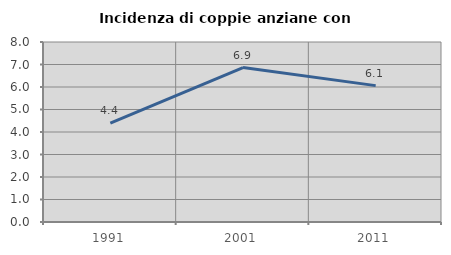
| Category | Incidenza di coppie anziane con figli |
|---|---|
| 1991.0 | 4.396 |
| 2001.0 | 6.863 |
| 2011.0 | 6.061 |